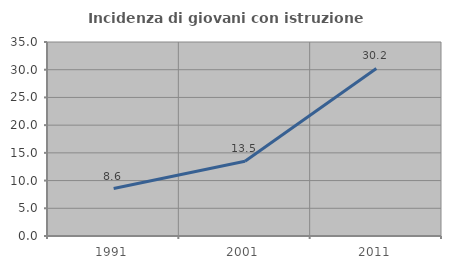
| Category | Incidenza di giovani con istruzione universitaria |
|---|---|
| 1991.0 | 8.565 |
| 2001.0 | 13.474 |
| 2011.0 | 30.233 |